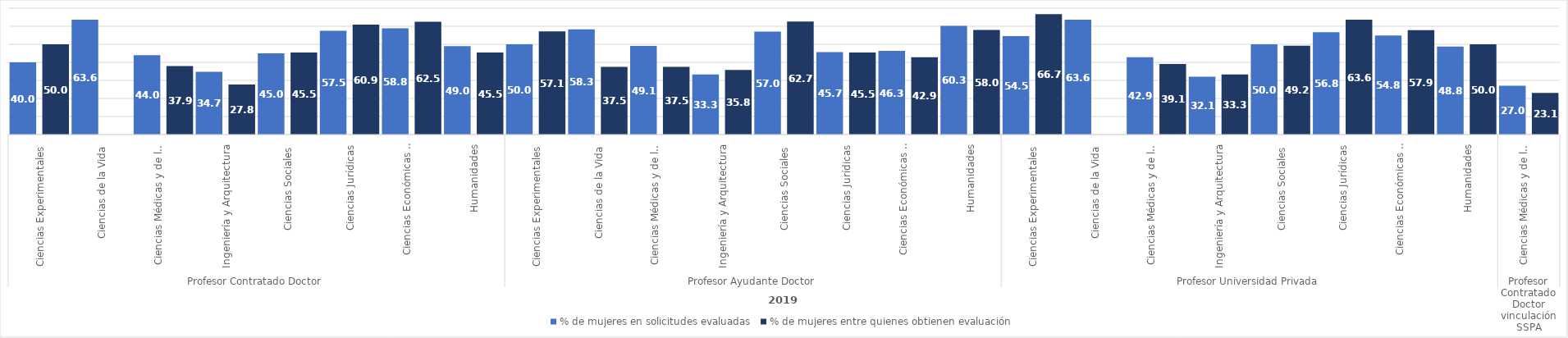
| Category | % de mujeres en solicitudes evaluadas | % de mujeres entre quienes obtienen evaluación |
|---|---|---|
| 0 | 40 | 50 |
| 1 | 63.636 | 0 |
| 2 | 44 | 37.931 |
| 3 | 34.722 | 27.778 |
| 4 | 44.954 | 45.455 |
| 5 | 57.5 | 60.87 |
| 6 | 58.824 | 62.5 |
| 7 | 48.98 | 45.455 |
| 8 | 50 | 57.143 |
| 9 | 58.333 | 37.5 |
| 10 | 49.091 | 37.5 |
| 11 | 33.333 | 35.849 |
| 12 | 57.047 | 62.651 |
| 13 | 45.652 | 45.455 |
| 14 | 46.341 | 42.857 |
| 15 | 60.274 | 58 |
| 16 | 54.545 | 66.667 |
| 17 | 63.636 | 0 |
| 18 | 42.857 | 39.13 |
| 19 | 32.075 | 33.333 |
| 20 | 50 | 49.18 |
| 21 | 56.757 | 63.636 |
| 22 | 54.839 | 57.895 |
| 23 | 48.78 | 50 |
| 24 | 27.027 | 23.077 |